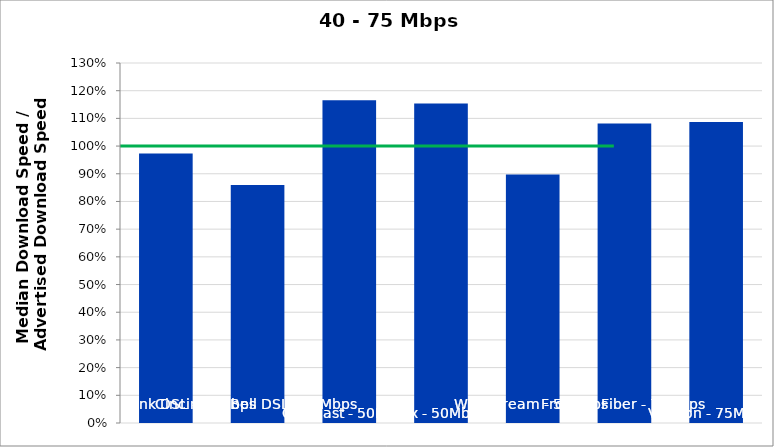
| Category | Series 0 |
|---|---|
| CenturyLink DSL - 40Mbps | 0.973 |
| Cincinnati Bell DSL - 50Mbps | 0.859 |
| Comcast - 50Mbps | 1.166 |
| Cox - 50Mbps | 1.154 |
| Windstream - 50Mbps | 0.897 |
| Frontier Fiber - 75Mbps | 1.082 |
| Verizon - 75Mbps | 1.087 |